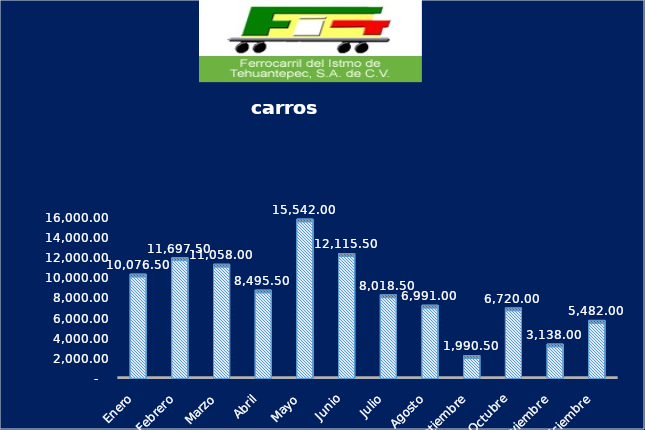
| Category | Series 0 |
|---|---|
| Enero | 10076.5 |
| Febrero | 11697.5 |
| Marzo | 11058 |
| Abril | 8495.5 |
| Mayo | 15542 |
| Junio | 12115.5 |
| Julio | 8018.5 |
| Agosto | 6991 |
| Septiembre | 1990.5 |
| Octubre | 6720 |
| Noviembre | 3138 |
| Diciembre | 5482 |